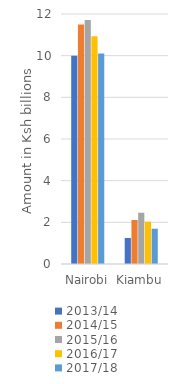
| Category | 2013/14 | 2014/15 | 2015/16 | 2016/17 | 2017/18  |
|---|---|---|---|---|---|
| Nairobi | 10000 | 11500.049 | 11710.008 | 10929.83 | 10109.419 |
| Kiambu | 1250 | 2110.857 | 2461.352 | 2032.981 | 1693.708 |